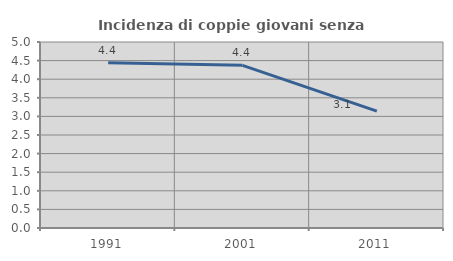
| Category | Incidenza di coppie giovani senza figli |
|---|---|
| 1991.0 | 4.44 |
| 2001.0 | 4.373 |
| 2011.0 | 3.141 |